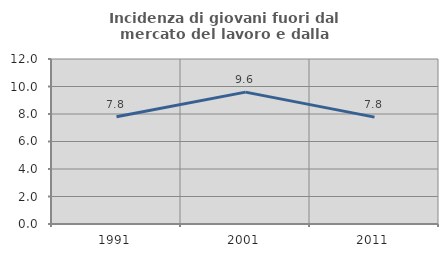
| Category | Incidenza di giovani fuori dal mercato del lavoro e dalla formazione  |
|---|---|
| 1991.0 | 7.797 |
| 2001.0 | 9.589 |
| 2011.0 | 7.772 |